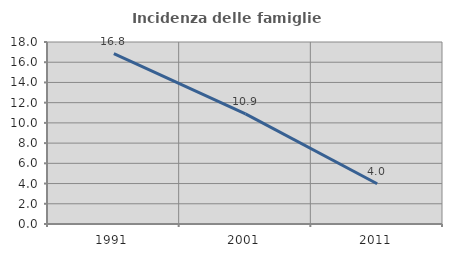
| Category | Incidenza delle famiglie numerose |
|---|---|
| 1991.0 | 16.848 |
| 2001.0 | 10.891 |
| 2011.0 | 3.982 |